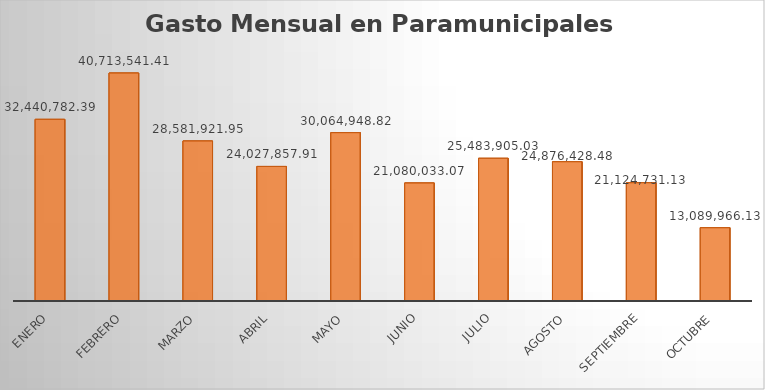
| Category | Monto |
|---|---|
| ENERO | 32440782.39 |
| FEBRERO | 40713541.41 |
| MARZO | 28581921.95 |
| ABRIL | 24027857.91 |
| MAYO | 30064948.82 |
| JUNIO | 21080033.07 |
| JULIO | 25483905.03 |
| AGOSTO | 24876428.48 |
| SEPTIEMBRE | 21124731.13 |
| OCTUBRE | 13089966.13 |